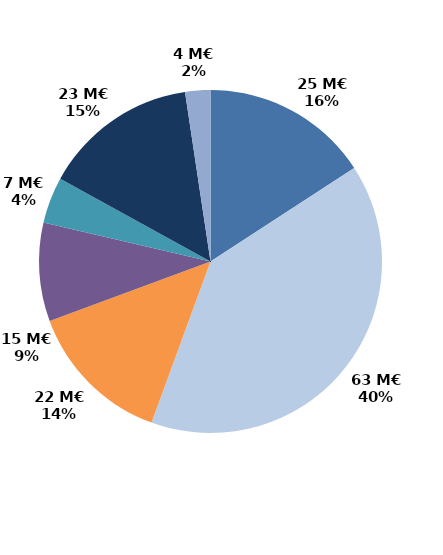
| Category | Series 0 |
|---|---|
| Accueil et information (CEP 1) | 25.194 |
| Accompagnement renforcé (CEP 2 et 3) | 63.394 |
| Suivi | 21.948 |
| Missions locales | 14.807 |
| CSP | 6.934 |
| Aide à la création d'entreprise | 23.3 |
| Aide à l'insertion | 3.785 |